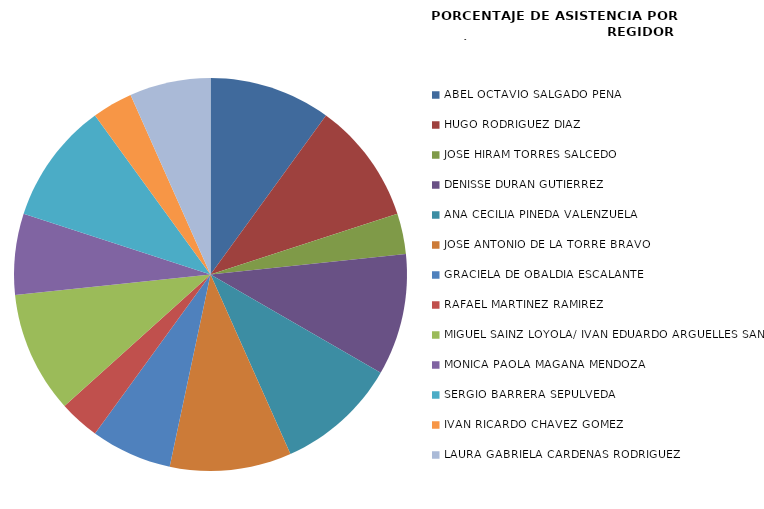
| Category | Series 0 |
|---|---|
| ABEL OCTAVIO SALGADO PEÑA | 100 |
| HUGO RODRÍGUEZ DÍAZ | 100 |
| JOSÉ HIRAM TORRES SALCEDO | 33.333 |
| DENISSE DURAN GUTIÉRREZ | 100 |
| ANA CECILIA PINEDA VALENZUELA | 100 |
| JOSÉ ANTONIO DE LA TORRE BRAVO | 100 |
| GRACIELA DE OBALDÍA ESCALANTE | 66.667 |
| RAFAEL MARTÍNEZ RAMÍREZ | 33.333 |
| MIGUEL SAINZ LOYOLA/ IVAN EDUARDO ARGÜELLES SÁNCEZ | 100 |
| MÓNICA PAOLA MAGAÑA MENDOZA | 66.667 |
| SERGIO BARRERA SEPÚLVEDA | 100 |
| IVÁN RICARDO CHÁVEZ GÓMEZ | 33.333 |
| LAURA GABRIELA CÁRDENAS RODRÍGUEZ | 66.667 |